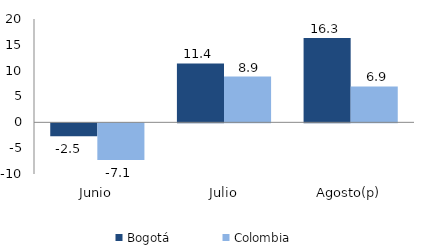
| Category | Bogotá | Colombia |
|---|---|---|
| Junio | -2.484 | -7.092 |
| Julio | 11.394 | 8.865 |
| Agosto(p) | 16.318 | 6.941 |